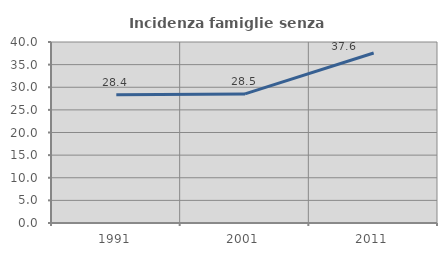
| Category | Incidenza famiglie senza nuclei |
|---|---|
| 1991.0 | 28.351 |
| 2001.0 | 28.535 |
| 2011.0 | 37.566 |